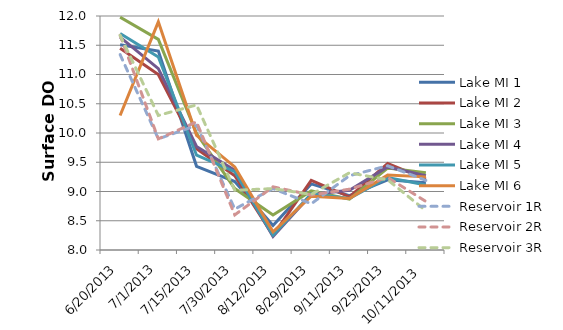
| Category | Lake MI 1 | Lake MI 2 | Lake MI 3 | Lake MI 4 | Lake MI 5 | Lake MI 6 | Reservoir 1R | Reservoir 2R | Reservoir 3R |
|---|---|---|---|---|---|---|---|---|---|
| 6/20/13 | 11.51 | 11.45 | 11.98 | 11.64 | 11.7 | 10.3 | 11.34 | 11.67 | 11.67 |
| 7/1/13 | 11.4 | 11 | 11.6 | 11.1 | 11.3 | 11.9 | 9.9 | 9.9 | 10.3 |
| 7/15/13 | 9.43 | 9.73 | 9.99 | 9.77 | 9.62 | 9.96 | 10.13 | 10.19 | 10.48 |
| 7/30/13 | 9.17 | 9.27 | 9.05 | 9.36 | 9.34 | 9.42 | 8.7 | 8.6 | 9.02 |
| 8/12/13 | 8.42 | 8.25 | 8.6 | 8.23 | 8.25 | 8.31 | 9.05 | 9.08 | 9.05 |
| 8/29/13 | 9.13 | 9.19 | 9.01 | 8.95 | 8.96 | 8.92 | 8.79 | 8.94 | 8.95 |
| 9/11/13 | 8.93 | 8.91 | 8.87 | 9.02 | 8.88 | 8.88 | 9.27 | 9.04 | 9.32 |
| 9/25/13 | 9.2 | 9.48 | 9.4 | 9.42 | 9.24 | 9.28 | 9.44 | 9.24 | 9.2 |
| 10/11/13 | 9.15 | 9.21 | 9.32 | 9.27 | 9.11 | 9.25 | 9.19 | 8.83 | 8.67 |